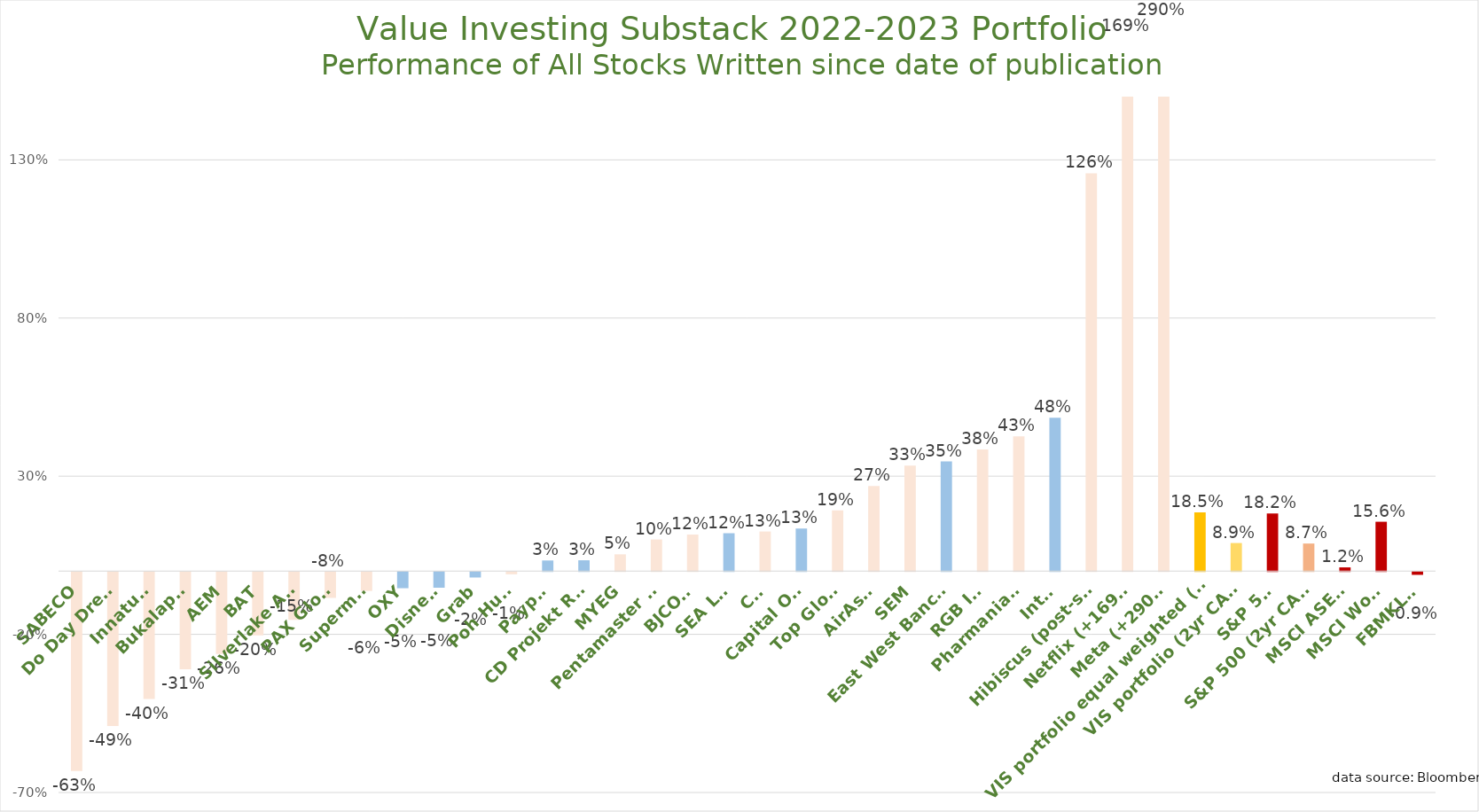
| Category | Series 0 |
|---|---|
| SABECO | -0.629 |
| Do Day Dream | -0.487 |
| Innature | -0.402 |
| Bukalapak | -0.308 |
| AEM | -0.259 |
| BAT | -0.201 |
| Silverlake Axis | -0.152 |
| PAX Global | -0.082 |
| Supermax | -0.06 |
| OXY | -0.051 |
| Disney  | -0.05 |
| Grab | -0.017 |
| Poh Huat | -0.007 |
| Paypal | 0.033 |
| CD Projekt Red | 0.034 |
| MYEG | 0.053 |
| Pentamaster HK | 0.1 |
| BJCORP | 0.115 |
| SEA Ltd | 0.12 |
| CNI | 0.125 |
| Capital One | 0.135 |
| Top Glove | 0.192 |
| AirAsia | 0.269 |
| SEM | 0.333 |
| East West Bancorp | 0.347 |
| RGB Intl | 0.385 |
| Pharmaniaga | 0.426 |
| Intel | 0.484 |
| Hibiscus (post-split) | 1.258 |
| Netflix (+169%) | 1.69 |
| Meta (+290%) | 2.899 |
| VIS portfolio equal weighted (DCA) | 0.185 |
| VIS portfolio (2yr CAGR) | 0.089 |
| S&P 500 | 0.182 |
| S&P 500 (2yr CAGR) | 0.087 |
| MSCI ASEAN | 0.012 |
| MSCI World | 0.156 |
| FBMKLCI | -0.009 |